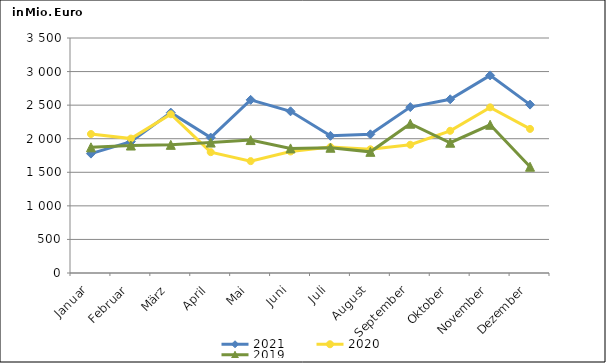
| Category | 2021 | 2020 | 2019 |
|---|---|---|---|
| Januar | 1778.013 | 2069.972 | 1871.773 |
| Februar | 1956.465 | 2001.984 | 1898.436 |
| März | 2388.73 | 2364.376 | 1908.612 |
| April | 2016.555 | 1799.748 | 1942.56 |
| Mai | 2578.881 | 1666.373 | 1979.751 |
| Juni | 2408.153 | 1810.278 | 1855.834 |
| Juli | 2042.955 | 1875.601 | 1865.603 |
| August | 2065.395 | 1842.082 | 1804.466 |
| September | 2470.843 | 1910.175 | 2223.139 |
| Oktober | 2587.26 | 2117.992 | 1940.168 |
| November | 2942.863 | 2467.112 | 2207.415 |
| Dezember | 2507.835 | 2146.172 | 1582.789 |